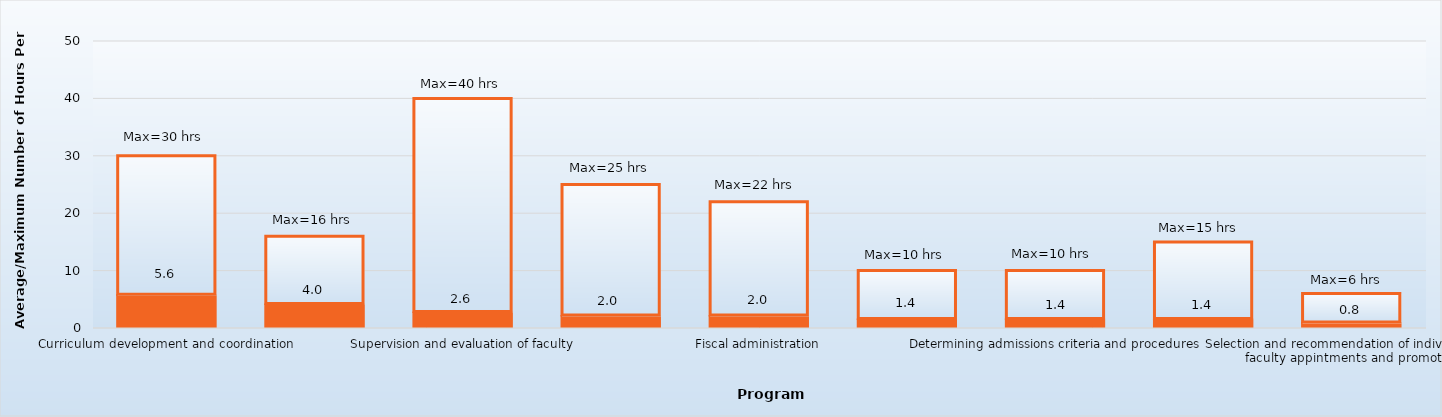
| Category | Average hours per week | Maximum |
|---|---|---|
| Curriculum development and coordination | 5.6 | 24.4 |
| Development and responsibilities to maintain CODA accreditation compliance and documentation | 4 | 12 |
| Supervision and evaluation of faculty | 2.6 | 37.4 |
| Determining faculty teaching assignments and schedules | 2 | 23 |
| Fiscal administration | 2 | 20 |
| Budget preparation | 1.4 | 8.6 |
| Determining admissions criteria and procedures | 1.4 | 8.6 |
| Scheduling use of program facilities | 1.4 | 13.6 |
| Selection and recommendation of individuals for faculty appintments and promotion | 0.8 | 5.2 |